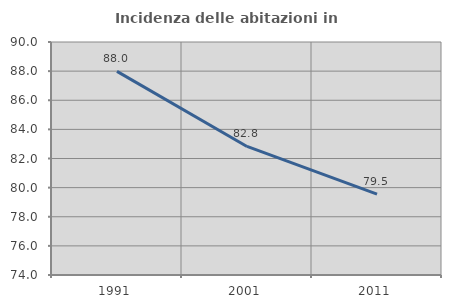
| Category | Incidenza delle abitazioni in proprietà  |
|---|---|
| 1991.0 | 87.983 |
| 2001.0 | 82.827 |
| 2011.0 | 79.549 |